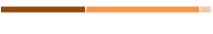
| Category | Series 0 | Series 1 | Series 2 |
|---|---|---|---|
| 0 | 0.405 | 0.541 | 0.054 |